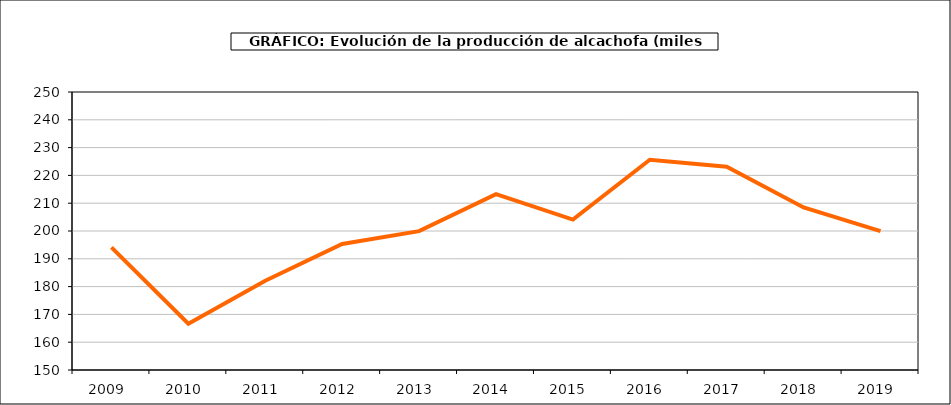
| Category | producción |
|---|---|
| 2009.0 | 194.099 |
| 2010.0 | 166.662 |
| 2011.0 | 182.1 |
| 2012.0 | 195.342 |
| 2013.0 | 199.945 |
| 2014.0 | 213.258 |
| 2015.0 | 204.111 |
| 2016.0 | 225.616 |
| 2017.0 | 223.15 |
| 2018.0 | 208.463 |
| 2019.0 | 199.944 |